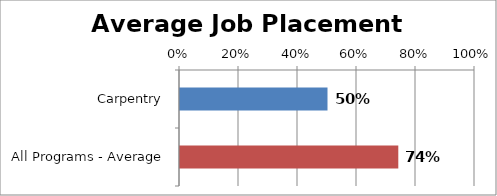
| Category | Series 0 |
|---|---|
| Carpentry | 0.5 |
| All Programs - Average | 0.74 |